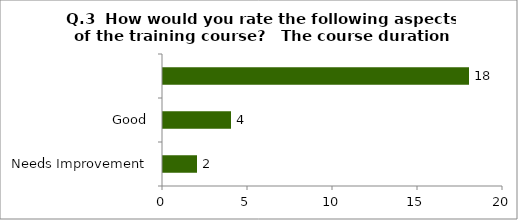
| Category | Q.3  How would you rate the following aspects of the training course?   The course duration |
|---|---|
| Needs Improvement | 2 |
| Good | 4 |
|  | 18 |